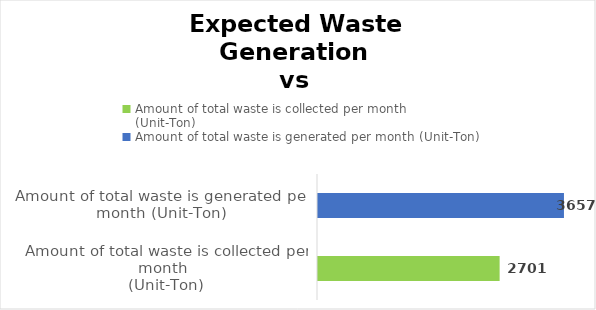
| Category | Series 0 |
|---|---|
| Amount of total waste is collected per month 
(Unit-Ton) | 2700.783 |
| Amount of total waste is generated per month (Unit-Ton) | 3657.432 |